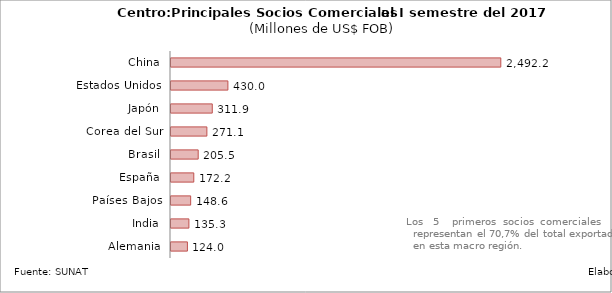
| Category | Series 0 |
|---|---|
| China | 2492.188 |
| Estados Unidos | 429.974 |
| Japón | 311.855 |
| Corea del Sur | 271.133 |
| Brasil | 205.534 |
| España | 172.222 |
| Países Bajos | 148.612 |
| India | 135.276 |
| Alemania | 123.981 |